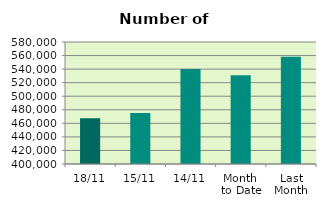
| Category | Series 0 |
|---|---|
| 18/11 | 467462 |
| 15/11 | 475204 |
| 14/11 | 540060 |
| Month 
to Date | 530794.5 |
| Last
Month | 558199.478 |